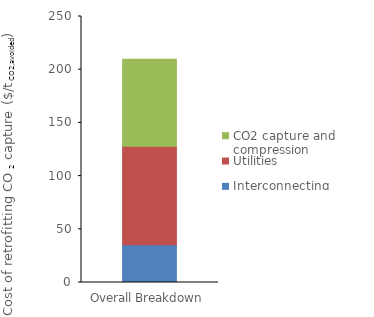
| Category | Interconnecting | Utilities | CO2 capture and compression |
|---|---|---|---|
| 0 | 35.433 | 92.688 | 81.702 |